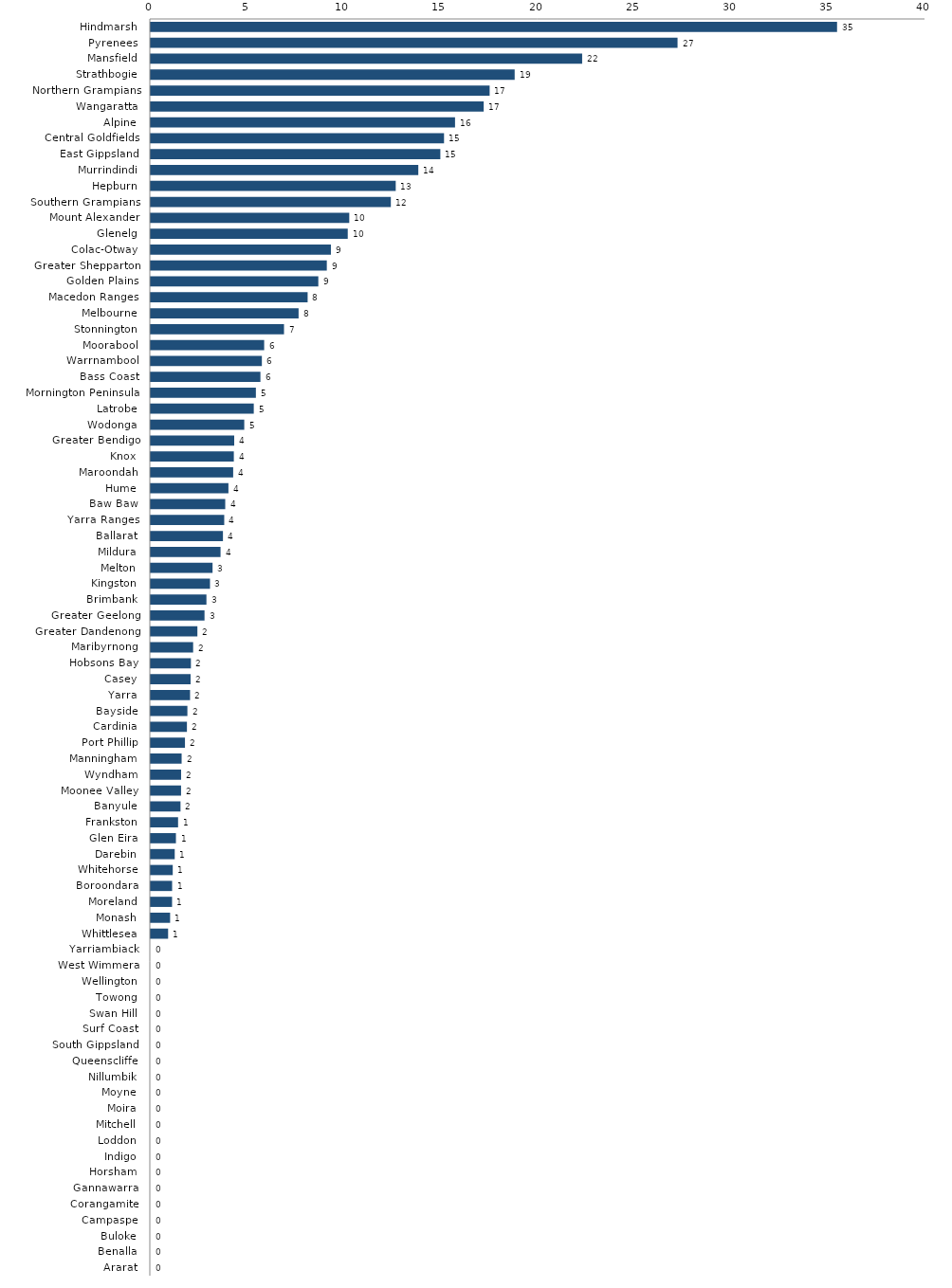
| Category | Series 0 |
|---|---|
| Hindmarsh  | 35.436 |
| Pyrenees  | 27.2 |
| Mansfield  | 22.274 |
| Strathbogie  | 18.79 |
| Northern Grampians  | 17.498 |
| Wangaratta  | 17.19 |
| Alpine  | 15.711 |
| Central Goldfields  | 15.142 |
| East Gippsland  | 14.952 |
| Murrindindi  | 13.814 |
| Hepburn  | 12.649 |
| Southern Grampians  | 12.396 |
| Mount Alexander  | 10.249 |
| Glenelg  | 10.171 |
| Colac-Otway  | 9.301 |
| Greater Shepparton  | 9.09 |
| Golden Plains  | 8.651 |
| Macedon Ranges  | 8.099 |
| Melbourne  | 7.633 |
| Stonnington  | 6.88 |
| Moorabool  | 5.855 |
| Warrnambool  | 5.737 |
| Bass Coast  | 5.662 |
| Mornington Peninsula  | 5.427 |
| Latrobe  | 5.319 |
| Wodonga  | 4.828 |
| Greater Bendigo  | 4.309 |
| Knox  | 4.289 |
| Maroondah  | 4.255 |
| Hume  | 4.01 |
| Baw Baw  | 3.845 |
| Yarra Ranges  | 3.793 |
| Ballarat  | 3.727 |
| Mildura  | 3.603 |
| Melton  | 3.19 |
| Kingston  | 3.059 |
| Brimbank  | 2.874 |
| Greater Geelong  | 2.775 |
| Greater Dandenong  | 2.408 |
| Maribyrnong  | 2.188 |
| Hobsons Bay  | 2.073 |
| Casey  | 2.056 |
| Yarra  | 2.029 |
| Bayside  | 1.891 |
| Cardinia  | 1.867 |
| Port Phillip  | 1.766 |
| Manningham  | 1.593 |
| Wyndham  | 1.566 |
| Moonee Valley  | 1.564 |
| Banyule  | 1.536 |
| Frankston  | 1.41 |
| Glen Eira  | 1.299 |
| Darebin  | 1.237 |
| Whitehorse  | 1.135 |
| Boroondara  | 1.103 |
| Moreland  | 1.1 |
| Monash  | 0.999 |
| Whittlesea  | 0.895 |
| Yarriambiack  | 0 |
| West Wimmera  | 0 |
| Wellington  | 0 |
| Towong  | 0 |
| Swan Hill  | 0 |
| Surf Coast  | 0 |
| South Gippsland  | 0 |
| Queenscliffe  | 0 |
| Nillumbik  | 0 |
| Moyne  | 0 |
| Moira  | 0 |
| Mitchell  | 0 |
| Loddon  | 0 |
| Indigo  | 0 |
| Horsham  | 0 |
| Gannawarra  | 0 |
| Corangamite  | 0 |
| Campaspe  | 0 |
| Buloke  | 0 |
| Benalla  | 0 |
| Ararat  | 0 |